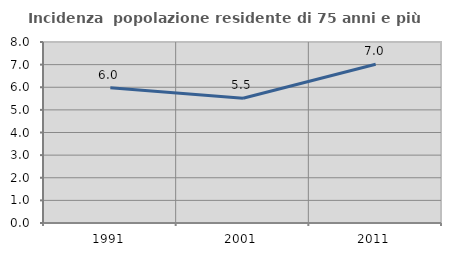
| Category | Incidenza  popolazione residente di 75 anni e più |
|---|---|
| 1991.0 | 5.981 |
| 2001.0 | 5.516 |
| 2011.0 | 7.018 |